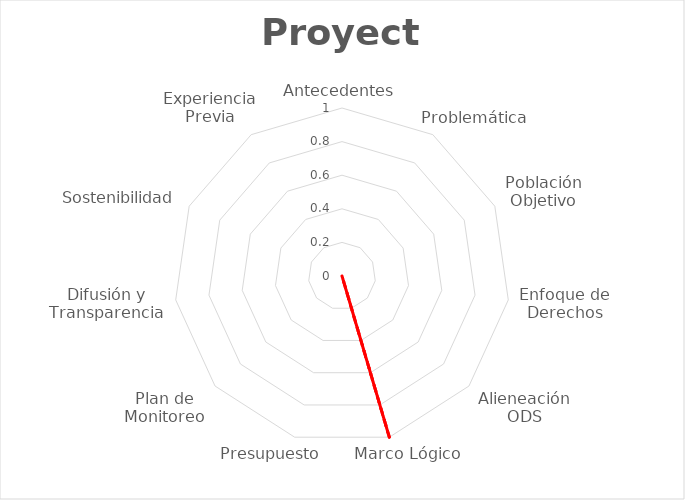
| Category | FDUM |
|---|---|
| Antecedentes | 0 |
| Problemática | 0 |
| Población Objetivo | 0 |
| Enfoque de Derechos | 0 |
| Alieneación ODS | 0 |
| Marco Lógico  | 1 |
| Presupuesto | 0 |
| Plan de Monitoreo | 0 |
| Difusión y Transparencia | 0 |
| Sostenibilidad | 0 |
| Experiencia Previa | 0 |